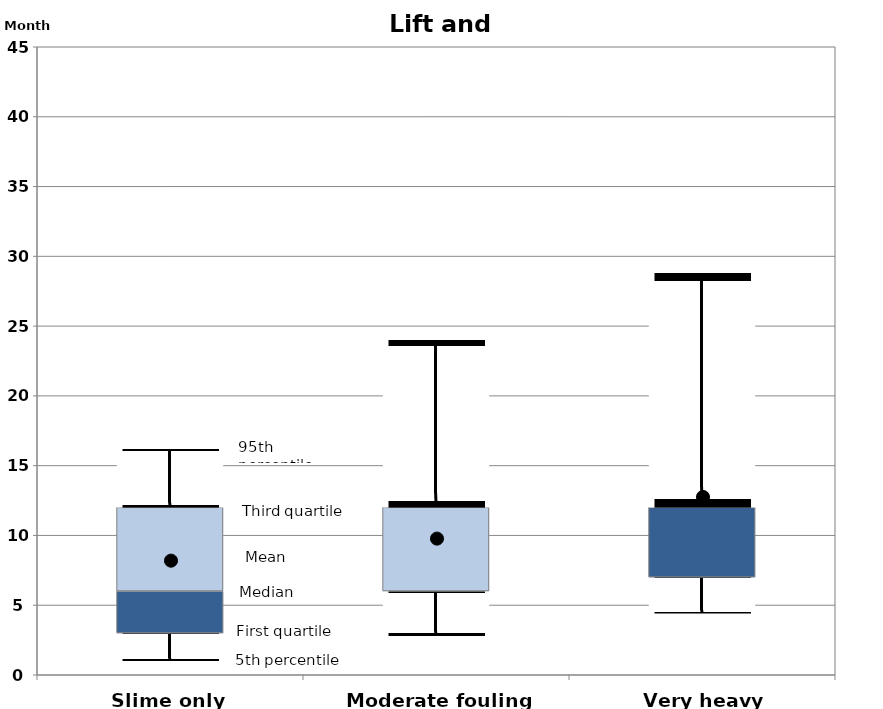
| Category | 5th percentile | First quartile | Second quartile | Third quartile | 95th percentile |
|---|---|---|---|---|---|
| Slime only | 1 | 2 | 3 | 6 | 4.2 |
| Moderate fouling | 2.8 | 3.2 | 0 | 6 | 12 |
| Very heavy fouling | 4.4 | 2.6 | 5 | 0 | 16.8 |